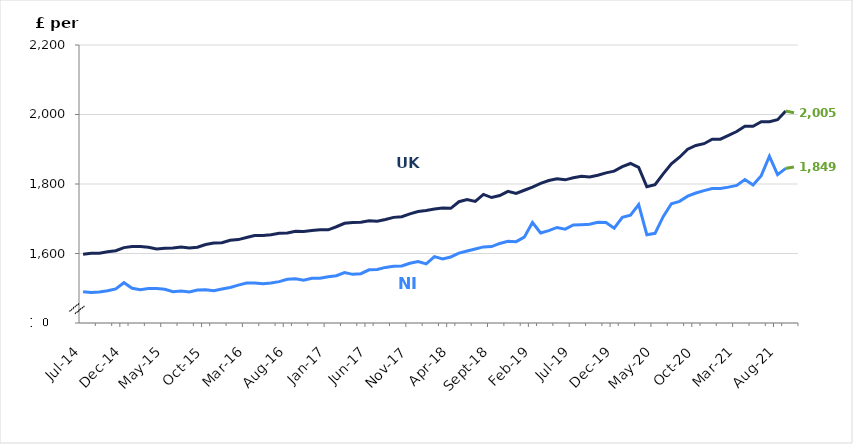
| Category | Series 0 | Series 1 |
|---|---|---|
| 2014-07-01 | 1490 | 1598 |
| 2014-08-01 | 1488 | 1601 |
| 2014-09-01 | 1489 | 1601 |
| 2014-10-01 | 1493 | 1605 |
| 2014-11-01 | 1498 | 1608 |
| 2014-12-01 | 1516 | 1617 |
| 2015-01-01 | 1500 | 1620 |
| 2015-02-01 | 1496 | 1620 |
| 2015-03-01 | 1499 | 1618 |
| 2015-04-01 | 1499 | 1613 |
| 2015-05-01 | 1497 | 1615 |
| 2015-06-01 | 1490 | 1616 |
| 2015-07-01 | 1492 | 1619 |
| 2015-08-01 | 1489 | 1616 |
| 2015-09-01 | 1495 | 1618 |
| 2015-10-01 | 1496 | 1626 |
| 2015-11-01 | 1493 | 1630 |
| 2015-12-01 | 1498 | 1631 |
| 2016-01-01 | 1502 | 1638 |
| 2016-02-01 | 1509 | 1640 |
| 2016-03-01 | 1515 | 1646 |
| 2016-04-01 | 1515 | 1652 |
| 2016-05-01 | 1513 | 1652 |
| 2016-06-01 | 1515 | 1654 |
| 2016-07-01 | 1519 | 1658 |
| 2016-08-01 | 1526 | 1659 |
| 2016-09-01 | 1527 | 1664 |
| 2016-10-01 | 1523 | 1663 |
| 2016-11-01 | 1529 | 1666 |
| 2016-12-01 | 1529 | 1668 |
| 2017-01-01 | 1533 | 1668 |
| 2017-02-01 | 1536 | 1677 |
| 2017-03-01 | 1545 | 1687 |
| 2017-04-01 | 1540 | 1689 |
| 2017-05-01 | 1542 | 1690 |
| 2017-06-01 | 1553 | 1694 |
| 2017-07-01 | 1554 | 1693 |
| 2017-08-01 | 1560 | 1698 |
| 2017-09-01 | 1563 | 1704 |
| 2017-10-01 | 1564 | 1706 |
| 2017-11-01 | 1572 | 1714 |
| 2017-12-01 | 1577 | 1721 |
| 2018-01-01 | 1570 | 1724 |
| 2018-02-01 | 1591 | 1728 |
| 2018-03-01 | 1584 | 1731 |
| 2018-04-01 | 1590 | 1730 |
| 2018-05-01 | 1601 | 1749 |
| 2018-06-01 | 1607 | 1755 |
| 2018-07-01 | 1613 | 1750 |
| 2018-08-01 | 1619 | 1770 |
| 2018-09-01 | 1620 | 1761 |
| 2018-10-01 | 1629 | 1767 |
| 2018-11-01 | 1635 | 1779 |
| 2018-12-01 | 1634 | 1773 |
| 2019-01-01 | 1647 | 1782 |
| 2019-02-01 | 1689 | 1791 |
| 2019-03-01 | 1659 | 1802 |
| 2019-04-01 | 1666 | 1810 |
| 2019-05-01 | 1675 | 1815 |
| 2019-06-01 | 1670 | 1812 |
| 2019-07-01 | 1682 | 1818 |
| 2019-08-01 | 1683 | 1822 |
| 2019-09-01 | 1684 | 1820 |
| 2019-10-01 | 1690 | 1825 |
| 2019-11-01 | 1689 | 1832 |
| 2019-12-01 | 1673 | 1837 |
| 2020-01-01 | 1704 | 1850 |
| 2020-02-01 | 1710 | 1859 |
| 2020-03-01 | 1741 | 1848 |
| 2020-04-01 | 1654 | 1792 |
| 2020-05-01 | 1658 | 1798 |
| 2020-06-01 | 1706 | 1829 |
| 2020-07-01 | 1743 | 1858 |
| 2020-08-01 | 1750 | 1877 |
| 2020-09-01 | 1765 | 1900 |
| 2020-10-01 | 1774 | 1911 |
| 2020-11-01 | 1781 | 1916 |
| 2020-12-01 | 1787 | 1929 |
| 2021-01-01 | 1787 | 1929 |
| 2021-02-01 | 1791 | 1940 |
| 2021-03-01 | 1796 | 1951 |
| 2021-04-01 | 1813 | 1966 |
| 2021-05-01 | 1797 | 1966 |
| 2021-06-01 | 1824 | 1979 |
| 2021-07-01 | 1880 | 1979 |
| 2021-08-01 | 1827 | 1985 |
| 2021-09-01 | 1845 | 2010 |
| 2021-10-01 | 1849 | 2005 |